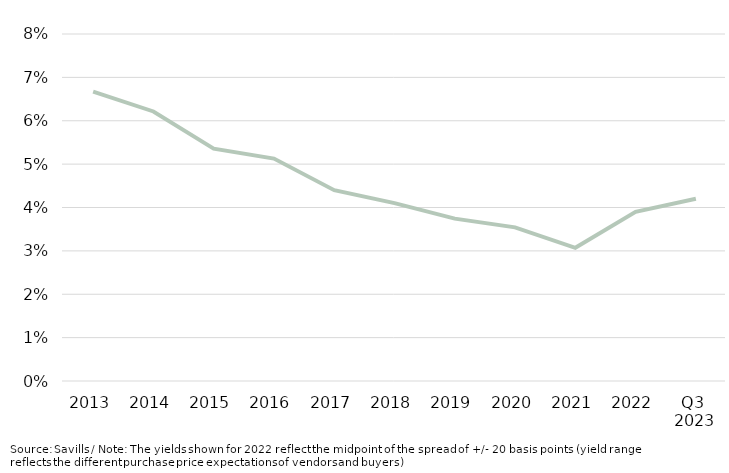
| Category | Prime yield |
|---|---|
| 2013 | 0.067 |
| 2014 | 0.062 |
| 2015 | 0.054 |
| 2016 | 0.051 |
| 2017 | 0.044 |
| 2018 | 0.041 |
| 2019 | 0.037 |
| 2020 | 0.035 |
| 2021 | 0.031 |
| 2022 | 0.039 |
| Q3 
2023 | 0.042 |